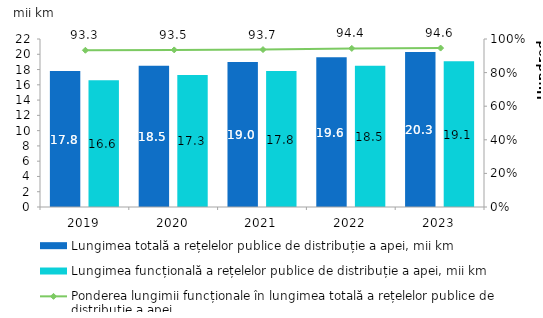
| Category | Lungimea totală a rețelelor publice de distribuție a apei, mii km | Lungimea funcțională a rețelelor publice de distribuție a apei, mii km |
|---|---|---|
| 2019.0 | 17.8 | 16.6 |
| 2020.0 | 18.5 | 17.3 |
| 2021.0 | 19 | 17.8 |
| 2022.0 | 19.6 | 18.5 |
| 2023.0 | 20.3 | 19.1 |